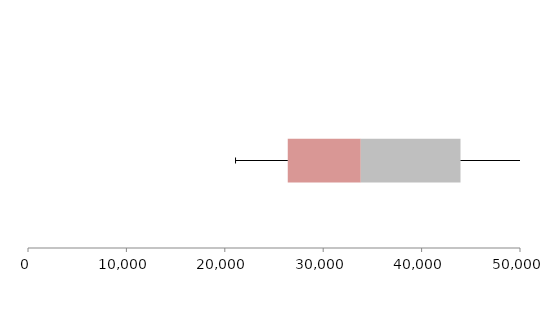
| Category | Series 1 | Series 2 | Series 3 |
|---|---|---|---|
| 0 | 26398.438 | 7419.866 | 10135.621 |